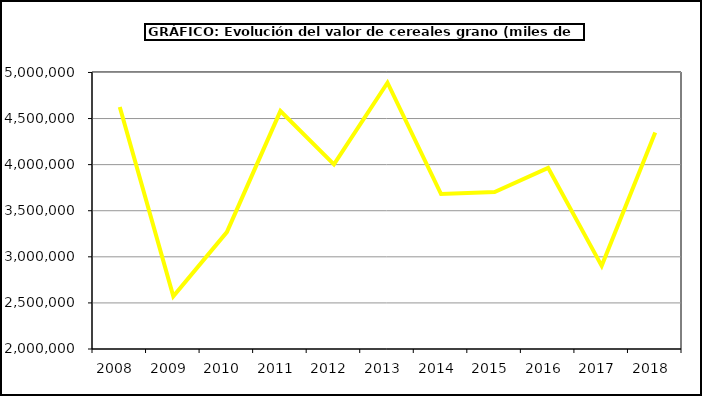
| Category | Valor |
|---|---|
| 2008.0 | 4625039.537 |
| 2009.0 | 2572134.163 |
| 2010.0 | 3268396.026 |
| 2011.0 | 4580902.717 |
| 2012.0 | 4003467.41 |
| 2013.0 | 4888762 |
| 2014.0 | 3681432.099 |
| 2015.0 | 3702937 |
| 2016.0 | 3964711.334 |
| 2017.0 | 2902062.238 |
| 2018.0 | 4348687.067 |